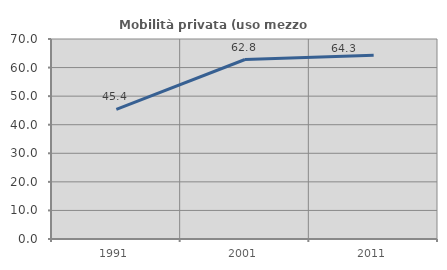
| Category | Mobilità privata (uso mezzo privato) |
|---|---|
| 1991.0 | 45.399 |
| 2001.0 | 62.819 |
| 2011.0 | 64.316 |